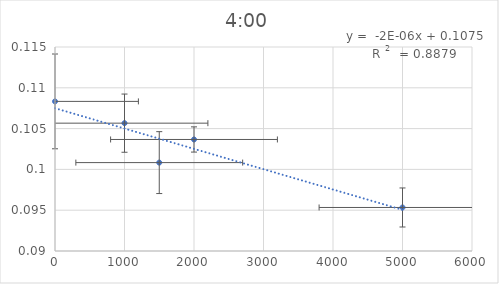
| Category | Series 0 |
|---|---|
| 5000.0 | 0.095 |
| 2000.0 | 0.104 |
| 1500.0 | 0.101 |
| 1000.0 | 0.106 |
| 0.0 | 0.108 |